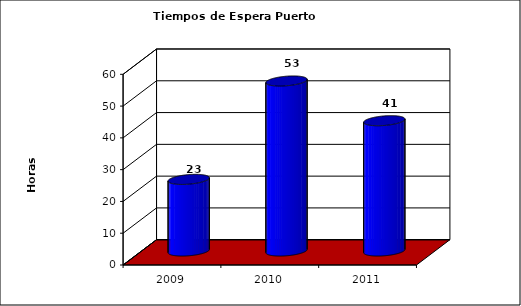
| Category | Series 0 |
|---|---|
| 2009.0 | 22.53 |
| 2010.0 | 53.49 |
| 2011.0 | 41 |